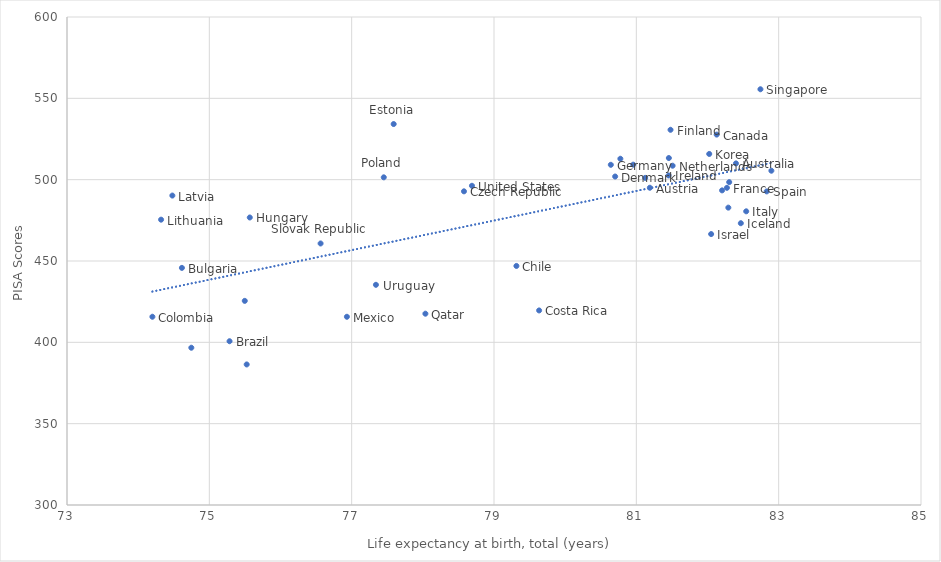
| Category | Series 0 |
|---|---|
| 82.4 | 509.994 |
| 81.19024390243904 | 495.037 |
| 75.284 | 400.682 |
| 74.61463414634147 | 445.772 |
| 82.12902439024391 | 527.705 |
| 79.315 | 446.956 |
| 74.2 | 415.729 |
| 79.634 | 419.608 |
| 78.5780487804878 | 492.83 |
| 80.70243902439024 | 501.937 |
| 77.59024390243903 | 534.194 |
| 81.48048780487807 | 530.661 |
| 82.27317073170734 | 494.978 |
| 80.64146341463415 | 509.141 |
| 75.56829268292685 | 476.748 |
| 82.46829268292684 | 473.23 |
| 81.45365853658538 | 502.575 |
| 82.05121951219512 | 466.553 |
| 82.5439024390244 | 480.547 |
| 82.02439024390245 | 515.81 |
| 74.48048780487805 | 490.225 |
| 74.32195121951221 | 475.409 |
| 82.29268292682927 | 482.806 |
| 76.933 | 415.71 |
| 81.509756097561 | 508.575 |
| 81.4568292682927 | 513.304 |
| 82.30487804878051 | 498.481 |
| 74.747 | 396.684 |
| 77.45121951219512 | 501.435 |
| 81.12439024390245 | 501.1 |
| 78.036 | 417.611 |
| 82.7439024390244 | 555.575 |
| 76.56341463414634 | 460.775 |
| 80.77560975609757 | 512.864 |
| 82.83170731707318 | 492.786 |
| 82.2048780487805 | 493.422 |
| 82.89756097560976 | 505.506 |
| 75.525 | 386.403 |
| 75.498 | 425.49 |
| 80.95609756097562 | 509.222 |
| 78.69024390243904 | 496.242 |
| 77.341 | 435.363 |